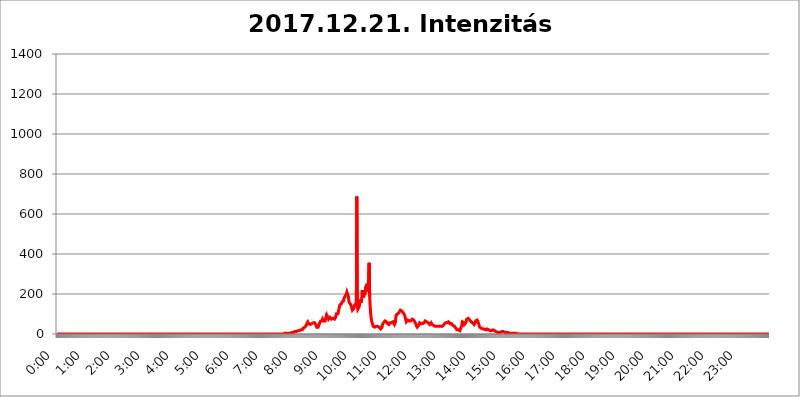
| Category | 2017.12.21. Intenzitás [W/m^2] |
|---|---|
| 0.0 | 0 |
| 0.0006944444444444445 | 0 |
| 0.001388888888888889 | 0 |
| 0.0020833333333333333 | 0 |
| 0.002777777777777778 | 0 |
| 0.003472222222222222 | 0 |
| 0.004166666666666667 | 0 |
| 0.004861111111111111 | 0 |
| 0.005555555555555556 | 0 |
| 0.0062499999999999995 | 0 |
| 0.006944444444444444 | 0 |
| 0.007638888888888889 | 0 |
| 0.008333333333333333 | 0 |
| 0.009027777777777779 | 0 |
| 0.009722222222222222 | 0 |
| 0.010416666666666666 | 0 |
| 0.011111111111111112 | 0 |
| 0.011805555555555555 | 0 |
| 0.012499999999999999 | 0 |
| 0.013194444444444444 | 0 |
| 0.013888888888888888 | 0 |
| 0.014583333333333332 | 0 |
| 0.015277777777777777 | 0 |
| 0.015972222222222224 | 0 |
| 0.016666666666666666 | 0 |
| 0.017361111111111112 | 0 |
| 0.018055555555555557 | 0 |
| 0.01875 | 0 |
| 0.019444444444444445 | 0 |
| 0.02013888888888889 | 0 |
| 0.020833333333333332 | 0 |
| 0.02152777777777778 | 0 |
| 0.022222222222222223 | 0 |
| 0.02291666666666667 | 0 |
| 0.02361111111111111 | 0 |
| 0.024305555555555556 | 0 |
| 0.024999999999999998 | 0 |
| 0.025694444444444447 | 0 |
| 0.02638888888888889 | 0 |
| 0.027083333333333334 | 0 |
| 0.027777777777777776 | 0 |
| 0.02847222222222222 | 0 |
| 0.029166666666666664 | 0 |
| 0.029861111111111113 | 0 |
| 0.030555555555555555 | 0 |
| 0.03125 | 0 |
| 0.03194444444444445 | 0 |
| 0.03263888888888889 | 0 |
| 0.03333333333333333 | 0 |
| 0.034027777777777775 | 0 |
| 0.034722222222222224 | 0 |
| 0.035416666666666666 | 0 |
| 0.036111111111111115 | 0 |
| 0.03680555555555556 | 0 |
| 0.0375 | 0 |
| 0.03819444444444444 | 0 |
| 0.03888888888888889 | 0 |
| 0.03958333333333333 | 0 |
| 0.04027777777777778 | 0 |
| 0.04097222222222222 | 0 |
| 0.041666666666666664 | 0 |
| 0.042361111111111106 | 0 |
| 0.04305555555555556 | 0 |
| 0.043750000000000004 | 0 |
| 0.044444444444444446 | 0 |
| 0.04513888888888889 | 0 |
| 0.04583333333333334 | 0 |
| 0.04652777777777778 | 0 |
| 0.04722222222222222 | 0 |
| 0.04791666666666666 | 0 |
| 0.04861111111111111 | 0 |
| 0.049305555555555554 | 0 |
| 0.049999999999999996 | 0 |
| 0.05069444444444445 | 0 |
| 0.051388888888888894 | 0 |
| 0.052083333333333336 | 0 |
| 0.05277777777777778 | 0 |
| 0.05347222222222222 | 0 |
| 0.05416666666666667 | 0 |
| 0.05486111111111111 | 0 |
| 0.05555555555555555 | 0 |
| 0.05625 | 0 |
| 0.05694444444444444 | 0 |
| 0.057638888888888885 | 0 |
| 0.05833333333333333 | 0 |
| 0.05902777777777778 | 0 |
| 0.059722222222222225 | 0 |
| 0.06041666666666667 | 0 |
| 0.061111111111111116 | 0 |
| 0.06180555555555556 | 0 |
| 0.0625 | 0 |
| 0.06319444444444444 | 0 |
| 0.06388888888888888 | 0 |
| 0.06458333333333334 | 0 |
| 0.06527777777777778 | 0 |
| 0.06597222222222222 | 0 |
| 0.06666666666666667 | 0 |
| 0.06736111111111111 | 0 |
| 0.06805555555555555 | 0 |
| 0.06874999999999999 | 0 |
| 0.06944444444444443 | 0 |
| 0.07013888888888889 | 0 |
| 0.07083333333333333 | 0 |
| 0.07152777777777779 | 0 |
| 0.07222222222222223 | 0 |
| 0.07291666666666667 | 0 |
| 0.07361111111111111 | 0 |
| 0.07430555555555556 | 0 |
| 0.075 | 0 |
| 0.07569444444444444 | 0 |
| 0.0763888888888889 | 0 |
| 0.07708333333333334 | 0 |
| 0.07777777777777778 | 0 |
| 0.07847222222222222 | 0 |
| 0.07916666666666666 | 0 |
| 0.0798611111111111 | 0 |
| 0.08055555555555556 | 0 |
| 0.08125 | 0 |
| 0.08194444444444444 | 0 |
| 0.08263888888888889 | 0 |
| 0.08333333333333333 | 0 |
| 0.08402777777777777 | 0 |
| 0.08472222222222221 | 0 |
| 0.08541666666666665 | 0 |
| 0.08611111111111112 | 0 |
| 0.08680555555555557 | 0 |
| 0.08750000000000001 | 0 |
| 0.08819444444444445 | 0 |
| 0.08888888888888889 | 0 |
| 0.08958333333333333 | 0 |
| 0.09027777777777778 | 0 |
| 0.09097222222222222 | 0 |
| 0.09166666666666667 | 0 |
| 0.09236111111111112 | 0 |
| 0.09305555555555556 | 0 |
| 0.09375 | 0 |
| 0.09444444444444444 | 0 |
| 0.09513888888888888 | 0 |
| 0.09583333333333333 | 0 |
| 0.09652777777777777 | 0 |
| 0.09722222222222222 | 0 |
| 0.09791666666666667 | 0 |
| 0.09861111111111111 | 0 |
| 0.09930555555555555 | 0 |
| 0.09999999999999999 | 0 |
| 0.10069444444444443 | 0 |
| 0.1013888888888889 | 0 |
| 0.10208333333333335 | 0 |
| 0.10277777777777779 | 0 |
| 0.10347222222222223 | 0 |
| 0.10416666666666667 | 0 |
| 0.10486111111111111 | 0 |
| 0.10555555555555556 | 0 |
| 0.10625 | 0 |
| 0.10694444444444444 | 0 |
| 0.1076388888888889 | 0 |
| 0.10833333333333334 | 0 |
| 0.10902777777777778 | 0 |
| 0.10972222222222222 | 0 |
| 0.1111111111111111 | 0 |
| 0.11180555555555556 | 0 |
| 0.11180555555555556 | 0 |
| 0.1125 | 0 |
| 0.11319444444444444 | 0 |
| 0.11388888888888889 | 0 |
| 0.11458333333333333 | 0 |
| 0.11527777777777777 | 0 |
| 0.11597222222222221 | 0 |
| 0.11666666666666665 | 0 |
| 0.1173611111111111 | 0 |
| 0.11805555555555557 | 0 |
| 0.11944444444444445 | 0 |
| 0.12013888888888889 | 0 |
| 0.12083333333333333 | 0 |
| 0.12152777777777778 | 0 |
| 0.12222222222222223 | 0 |
| 0.12291666666666667 | 0 |
| 0.12291666666666667 | 0 |
| 0.12361111111111112 | 0 |
| 0.12430555555555556 | 0 |
| 0.125 | 0 |
| 0.12569444444444444 | 0 |
| 0.12638888888888888 | 0 |
| 0.12708333333333333 | 0 |
| 0.16875 | 0 |
| 0.12847222222222224 | 0 |
| 0.12916666666666668 | 0 |
| 0.12986111111111112 | 0 |
| 0.13055555555555556 | 0 |
| 0.13125 | 0 |
| 0.13194444444444445 | 0 |
| 0.1326388888888889 | 0 |
| 0.13333333333333333 | 0 |
| 0.13402777777777777 | 0 |
| 0.13402777777777777 | 0 |
| 0.13472222222222222 | 0 |
| 0.13541666666666666 | 0 |
| 0.1361111111111111 | 0 |
| 0.13749999999999998 | 0 |
| 0.13819444444444443 | 0 |
| 0.1388888888888889 | 0 |
| 0.13958333333333334 | 0 |
| 0.14027777777777778 | 0 |
| 0.14097222222222222 | 0 |
| 0.14166666666666666 | 0 |
| 0.1423611111111111 | 0 |
| 0.14305555555555557 | 0 |
| 0.14375000000000002 | 0 |
| 0.14444444444444446 | 0 |
| 0.1451388888888889 | 0 |
| 0.1451388888888889 | 0 |
| 0.14652777777777778 | 0 |
| 0.14722222222222223 | 0 |
| 0.14791666666666667 | 0 |
| 0.1486111111111111 | 0 |
| 0.14930555555555555 | 0 |
| 0.15 | 0 |
| 0.15069444444444444 | 0 |
| 0.15138888888888888 | 0 |
| 0.15208333333333332 | 0 |
| 0.15277777777777776 | 0 |
| 0.15347222222222223 | 0 |
| 0.15416666666666667 | 0 |
| 0.15486111111111112 | 0 |
| 0.15555555555555556 | 0 |
| 0.15625 | 0 |
| 0.15694444444444444 | 0 |
| 0.15763888888888888 | 0 |
| 0.15833333333333333 | 0 |
| 0.15902777777777777 | 0 |
| 0.15972222222222224 | 0 |
| 0.16041666666666668 | 0 |
| 0.16111111111111112 | 0 |
| 0.16180555555555556 | 0 |
| 0.1625 | 0 |
| 0.16319444444444445 | 0 |
| 0.1638888888888889 | 0 |
| 0.16458333333333333 | 0 |
| 0.16527777777777777 | 0 |
| 0.16597222222222222 | 0 |
| 0.16666666666666666 | 0 |
| 0.1673611111111111 | 0 |
| 0.16805555555555554 | 0 |
| 0.16874999999999998 | 0 |
| 0.16944444444444443 | 0 |
| 0.17013888888888887 | 0 |
| 0.1708333333333333 | 0 |
| 0.17152777777777775 | 0 |
| 0.17222222222222225 | 0 |
| 0.1729166666666667 | 0 |
| 0.17361111111111113 | 0 |
| 0.17430555555555557 | 0 |
| 0.17500000000000002 | 0 |
| 0.17569444444444446 | 0 |
| 0.1763888888888889 | 0 |
| 0.17708333333333334 | 0 |
| 0.17777777777777778 | 0 |
| 0.17847222222222223 | 0 |
| 0.17916666666666667 | 0 |
| 0.1798611111111111 | 0 |
| 0.18055555555555555 | 0 |
| 0.18125 | 0 |
| 0.18194444444444444 | 0 |
| 0.1826388888888889 | 0 |
| 0.18333333333333335 | 0 |
| 0.1840277777777778 | 0 |
| 0.18472222222222223 | 0 |
| 0.18541666666666667 | 0 |
| 0.18611111111111112 | 0 |
| 0.18680555555555556 | 0 |
| 0.1875 | 0 |
| 0.18819444444444444 | 0 |
| 0.18888888888888888 | 0 |
| 0.18958333333333333 | 0 |
| 0.19027777777777777 | 0 |
| 0.1909722222222222 | 0 |
| 0.19166666666666665 | 0 |
| 0.19236111111111112 | 0 |
| 0.19305555555555554 | 0 |
| 0.19375 | 0 |
| 0.19444444444444445 | 0 |
| 0.1951388888888889 | 0 |
| 0.19583333333333333 | 0 |
| 0.19652777777777777 | 0 |
| 0.19722222222222222 | 0 |
| 0.19791666666666666 | 0 |
| 0.1986111111111111 | 0 |
| 0.19930555555555554 | 0 |
| 0.19999999999999998 | 0 |
| 0.20069444444444443 | 0 |
| 0.20138888888888887 | 0 |
| 0.2020833333333333 | 0 |
| 0.2027777777777778 | 0 |
| 0.2034722222222222 | 0 |
| 0.2041666666666667 | 0 |
| 0.20486111111111113 | 0 |
| 0.20555555555555557 | 0 |
| 0.20625000000000002 | 0 |
| 0.20694444444444446 | 0 |
| 0.2076388888888889 | 0 |
| 0.20833333333333334 | 0 |
| 0.20902777777777778 | 0 |
| 0.20972222222222223 | 0 |
| 0.21041666666666667 | 0 |
| 0.2111111111111111 | 0 |
| 0.21180555555555555 | 0 |
| 0.2125 | 0 |
| 0.21319444444444444 | 0 |
| 0.2138888888888889 | 0 |
| 0.21458333333333335 | 0 |
| 0.2152777777777778 | 0 |
| 0.21597222222222223 | 0 |
| 0.21666666666666667 | 0 |
| 0.21736111111111112 | 0 |
| 0.21805555555555556 | 0 |
| 0.21875 | 0 |
| 0.21944444444444444 | 0 |
| 0.22013888888888888 | 0 |
| 0.22083333333333333 | 0 |
| 0.22152777777777777 | 0 |
| 0.2222222222222222 | 0 |
| 0.22291666666666665 | 0 |
| 0.2236111111111111 | 0 |
| 0.22430555555555556 | 0 |
| 0.225 | 0 |
| 0.22569444444444445 | 0 |
| 0.2263888888888889 | 0 |
| 0.22708333333333333 | 0 |
| 0.22777777777777777 | 0 |
| 0.22847222222222222 | 0 |
| 0.22916666666666666 | 0 |
| 0.2298611111111111 | 0 |
| 0.23055555555555554 | 0 |
| 0.23124999999999998 | 0 |
| 0.23194444444444443 | 0 |
| 0.23263888888888887 | 0 |
| 0.2333333333333333 | 0 |
| 0.2340277777777778 | 0 |
| 0.2347222222222222 | 0 |
| 0.2354166666666667 | 0 |
| 0.23611111111111113 | 0 |
| 0.23680555555555557 | 0 |
| 0.23750000000000002 | 0 |
| 0.23819444444444446 | 0 |
| 0.2388888888888889 | 0 |
| 0.23958333333333334 | 0 |
| 0.24027777777777778 | 0 |
| 0.24097222222222223 | 0 |
| 0.24166666666666667 | 0 |
| 0.2423611111111111 | 0 |
| 0.24305555555555555 | 0 |
| 0.24375 | 0 |
| 0.24444444444444446 | 0 |
| 0.24513888888888888 | 0 |
| 0.24583333333333335 | 0 |
| 0.2465277777777778 | 0 |
| 0.24722222222222223 | 0 |
| 0.24791666666666667 | 0 |
| 0.24861111111111112 | 0 |
| 0.24930555555555556 | 0 |
| 0.25 | 0 |
| 0.25069444444444444 | 0 |
| 0.2513888888888889 | 0 |
| 0.2520833333333333 | 0 |
| 0.25277777777777777 | 0 |
| 0.2534722222222222 | 0 |
| 0.25416666666666665 | 0 |
| 0.2548611111111111 | 0 |
| 0.2555555555555556 | 0 |
| 0.25625000000000003 | 0 |
| 0.2569444444444445 | 0 |
| 0.2576388888888889 | 0 |
| 0.25833333333333336 | 0 |
| 0.2590277777777778 | 0 |
| 0.25972222222222224 | 0 |
| 0.2604166666666667 | 0 |
| 0.2611111111111111 | 0 |
| 0.26180555555555557 | 0 |
| 0.2625 | 0 |
| 0.26319444444444445 | 0 |
| 0.2638888888888889 | 0 |
| 0.26458333333333334 | 0 |
| 0.2652777777777778 | 0 |
| 0.2659722222222222 | 0 |
| 0.26666666666666666 | 0 |
| 0.2673611111111111 | 0 |
| 0.26805555555555555 | 0 |
| 0.26875 | 0 |
| 0.26944444444444443 | 0 |
| 0.2701388888888889 | 0 |
| 0.2708333333333333 | 0 |
| 0.27152777777777776 | 0 |
| 0.2722222222222222 | 0 |
| 0.27291666666666664 | 0 |
| 0.2736111111111111 | 0 |
| 0.2743055555555555 | 0 |
| 0.27499999999999997 | 0 |
| 0.27569444444444446 | 0 |
| 0.27638888888888885 | 0 |
| 0.27708333333333335 | 0 |
| 0.2777777777777778 | 0 |
| 0.27847222222222223 | 0 |
| 0.2791666666666667 | 0 |
| 0.2798611111111111 | 0 |
| 0.28055555555555556 | 0 |
| 0.28125 | 0 |
| 0.28194444444444444 | 0 |
| 0.2826388888888889 | 0 |
| 0.2833333333333333 | 0 |
| 0.28402777777777777 | 0 |
| 0.2847222222222222 | 0 |
| 0.28541666666666665 | 0 |
| 0.28611111111111115 | 0 |
| 0.28680555555555554 | 0 |
| 0.28750000000000003 | 0 |
| 0.2881944444444445 | 0 |
| 0.2888888888888889 | 0 |
| 0.28958333333333336 | 0 |
| 0.2902777777777778 | 0 |
| 0.29097222222222224 | 0 |
| 0.2916666666666667 | 0 |
| 0.2923611111111111 | 0 |
| 0.29305555555555557 | 0 |
| 0.29375 | 0 |
| 0.29444444444444445 | 0 |
| 0.2951388888888889 | 0 |
| 0.29583333333333334 | 0 |
| 0.2965277777777778 | 0 |
| 0.2972222222222222 | 0 |
| 0.29791666666666666 | 0 |
| 0.2986111111111111 | 0 |
| 0.29930555555555555 | 0 |
| 0.3 | 0 |
| 0.30069444444444443 | 0 |
| 0.3013888888888889 | 0 |
| 0.3020833333333333 | 0 |
| 0.30277777777777776 | 0 |
| 0.3034722222222222 | 0 |
| 0.30416666666666664 | 0 |
| 0.3048611111111111 | 0 |
| 0.3055555555555555 | 0 |
| 0.30624999999999997 | 0 |
| 0.3069444444444444 | 0 |
| 0.3076388888888889 | 0 |
| 0.30833333333333335 | 0 |
| 0.3090277777777778 | 0 |
| 0.30972222222222223 | 0 |
| 0.3104166666666667 | 0 |
| 0.3111111111111111 | 0 |
| 0.31180555555555556 | 0 |
| 0.3125 | 0 |
| 0.31319444444444444 | 0 |
| 0.3138888888888889 | 0 |
| 0.3145833333333333 | 0 |
| 0.31527777777777777 | 0 |
| 0.3159722222222222 | 0 |
| 0.31666666666666665 | 0 |
| 0.31736111111111115 | 0 |
| 0.31805555555555554 | 0 |
| 0.31875000000000003 | 3.525 |
| 0.3194444444444445 | 3.525 |
| 0.3201388888888889 | 3.525 |
| 0.32083333333333336 | 3.525 |
| 0.3215277777777778 | 3.525 |
| 0.32222222222222224 | 3.525 |
| 0.3229166666666667 | 3.525 |
| 0.3236111111111111 | 3.525 |
| 0.32430555555555557 | 3.525 |
| 0.325 | 3.525 |
| 0.32569444444444445 | 3.525 |
| 0.3263888888888889 | 3.525 |
| 0.32708333333333334 | 3.525 |
| 0.3277777777777778 | 3.525 |
| 0.3284722222222222 | 3.525 |
| 0.32916666666666666 | 7.887 |
| 0.3298611111111111 | 7.887 |
| 0.33055555555555555 | 7.887 |
| 0.33125 | 7.887 |
| 0.33194444444444443 | 7.887 |
| 0.3326388888888889 | 12.257 |
| 0.3333333333333333 | 12.257 |
| 0.3340277777777778 | 12.257 |
| 0.3347222222222222 | 12.257 |
| 0.3354166666666667 | 12.257 |
| 0.3361111111111111 | 12.257 |
| 0.3368055555555556 | 12.257 |
| 0.33749999999999997 | 16.636 |
| 0.33819444444444446 | 16.636 |
| 0.33888888888888885 | 16.636 |
| 0.33958333333333335 | 16.636 |
| 0.34027777777777773 | 16.636 |
| 0.34097222222222223 | 21.024 |
| 0.3416666666666666 | 21.024 |
| 0.3423611111111111 | 21.024 |
| 0.3430555555555555 | 21.024 |
| 0.34375 | 21.024 |
| 0.3444444444444445 | 25.419 |
| 0.3451388888888889 | 29.823 |
| 0.3458333333333334 | 29.823 |
| 0.34652777777777777 | 29.823 |
| 0.34722222222222227 | 34.234 |
| 0.34791666666666665 | 34.234 |
| 0.34861111111111115 | 38.653 |
| 0.34930555555555554 | 43.079 |
| 0.35000000000000003 | 51.951 |
| 0.3506944444444444 | 56.398 |
| 0.3513888888888889 | 60.85 |
| 0.3520833333333333 | 56.398 |
| 0.3527777777777778 | 51.951 |
| 0.3534722222222222 | 47.511 |
| 0.3541666666666667 | 47.511 |
| 0.3548611111111111 | 47.511 |
| 0.35555555555555557 | 47.511 |
| 0.35625 | 51.951 |
| 0.35694444444444445 | 51.951 |
| 0.3576388888888889 | 56.398 |
| 0.35833333333333334 | 56.398 |
| 0.3590277777777778 | 56.398 |
| 0.3597222222222222 | 51.951 |
| 0.36041666666666666 | 51.951 |
| 0.3611111111111111 | 56.398 |
| 0.36180555555555555 | 56.398 |
| 0.3625 | 47.511 |
| 0.36319444444444443 | 43.079 |
| 0.3638888888888889 | 34.234 |
| 0.3645833333333333 | 34.234 |
| 0.3652777777777778 | 34.234 |
| 0.3659722222222222 | 34.234 |
| 0.3666666666666667 | 38.653 |
| 0.3673611111111111 | 47.511 |
| 0.3680555555555556 | 56.398 |
| 0.36874999999999997 | 56.398 |
| 0.36944444444444446 | 65.31 |
| 0.37013888888888885 | 65.31 |
| 0.37083333333333335 | 60.85 |
| 0.37152777777777773 | 65.31 |
| 0.37222222222222223 | 74.246 |
| 0.3729166666666666 | 74.246 |
| 0.3736111111111111 | 65.31 |
| 0.3743055555555555 | 60.85 |
| 0.375 | 65.31 |
| 0.3756944444444445 | 65.31 |
| 0.3763888888888889 | 69.775 |
| 0.3770833333333334 | 87.692 |
| 0.37777777777777777 | 96.682 |
| 0.37847222222222227 | 101.184 |
| 0.37916666666666665 | 92.184 |
| 0.37986111111111115 | 83.205 |
| 0.38055555555555554 | 74.246 |
| 0.38125000000000003 | 74.246 |
| 0.3819444444444444 | 74.246 |
| 0.3826388888888889 | 83.205 |
| 0.3833333333333333 | 83.205 |
| 0.3840277777777778 | 78.722 |
| 0.3847222222222222 | 74.246 |
| 0.3854166666666667 | 74.246 |
| 0.3861111111111111 | 74.246 |
| 0.38680555555555557 | 78.722 |
| 0.3875 | 74.246 |
| 0.38819444444444445 | 74.246 |
| 0.3888888888888889 | 74.246 |
| 0.38958333333333334 | 78.722 |
| 0.3902777777777778 | 83.205 |
| 0.3909722222222222 | 92.184 |
| 0.39166666666666666 | 101.184 |
| 0.3923611111111111 | 96.682 |
| 0.39305555555555555 | 101.184 |
| 0.39375 | 101.184 |
| 0.39444444444444443 | 114.716 |
| 0.3951388888888889 | 123.758 |
| 0.3958333333333333 | 137.347 |
| 0.3965277777777778 | 146.423 |
| 0.3972222222222222 | 146.423 |
| 0.3979166666666667 | 146.423 |
| 0.3986111111111111 | 150.964 |
| 0.3993055555555556 | 160.056 |
| 0.39999999999999997 | 155.509 |
| 0.40069444444444446 | 155.509 |
| 0.40138888888888885 | 164.605 |
| 0.40208333333333335 | 178.264 |
| 0.40277777777777773 | 182.82 |
| 0.40347222222222223 | 187.378 |
| 0.4041666666666666 | 187.378 |
| 0.4048611111111111 | 191.937 |
| 0.4055555555555555 | 201.058 |
| 0.40625 | 210.182 |
| 0.4069444444444445 | 214.746 |
| 0.4076388888888889 | 214.746 |
| 0.4083333333333334 | 187.378 |
| 0.40902777777777777 | 164.605 |
| 0.40972222222222227 | 155.509 |
| 0.41041666666666665 | 150.964 |
| 0.41111111111111115 | 150.964 |
| 0.41180555555555554 | 146.423 |
| 0.41250000000000003 | 137.347 |
| 0.4131944444444444 | 128.284 |
| 0.4138888888888889 | 119.235 |
| 0.4145833333333333 | 119.235 |
| 0.4152777777777778 | 123.758 |
| 0.4159722222222222 | 128.284 |
| 0.4166666666666667 | 137.347 |
| 0.4173611111111111 | 146.423 |
| 0.41805555555555557 | 146.423 |
| 0.41875 | 146.423 |
| 0.41944444444444445 | 150.964 |
| 0.4201388888888889 | 687.544 |
| 0.42083333333333334 | 141.884 |
| 0.4215277777777778 | 123.758 |
| 0.4222222222222222 | 119.235 |
| 0.42291666666666666 | 128.284 |
| 0.4236111111111111 | 137.347 |
| 0.42430555555555555 | 155.509 |
| 0.425 | 173.709 |
| 0.42569444444444443 | 155.509 |
| 0.4263888888888889 | 150.964 |
| 0.4270833333333333 | 173.709 |
| 0.4277777777777778 | 219.309 |
| 0.4284722222222222 | 201.058 |
| 0.4291666666666667 | 191.937 |
| 0.4298611111111111 | 182.82 |
| 0.4305555555555556 | 214.746 |
| 0.43124999999999997 | 196.497 |
| 0.43194444444444446 | 214.746 |
| 0.43263888888888885 | 237.564 |
| 0.43333333333333335 | 223.873 |
| 0.43402777777777773 | 251.251 |
| 0.43472222222222223 | 255.813 |
| 0.4354166666666666 | 228.436 |
| 0.4361111111111111 | 210.182 |
| 0.4368055555555555 | 205.62 |
| 0.4375 | 355.712 |
| 0.4381944444444445 | 187.378 |
| 0.4388888888888889 | 137.347 |
| 0.4395833333333334 | 101.184 |
| 0.44027777777777777 | 78.722 |
| 0.44097222222222227 | 65.31 |
| 0.44166666666666665 | 56.398 |
| 0.44236111111111115 | 47.511 |
| 0.44305555555555554 | 38.653 |
| 0.44375000000000003 | 38.653 |
| 0.4444444444444444 | 38.653 |
| 0.4451388888888889 | 34.234 |
| 0.4458333333333333 | 34.234 |
| 0.4465277777777778 | 34.234 |
| 0.4472222222222222 | 38.653 |
| 0.4479166666666667 | 38.653 |
| 0.4486111111111111 | 38.653 |
| 0.44930555555555557 | 38.653 |
| 0.45 | 38.653 |
| 0.45069444444444445 | 38.653 |
| 0.4513888888888889 | 34.234 |
| 0.45208333333333334 | 34.234 |
| 0.4527777777777778 | 29.823 |
| 0.4534722222222222 | 25.419 |
| 0.45416666666666666 | 25.419 |
| 0.4548611111111111 | 25.419 |
| 0.45555555555555555 | 34.234 |
| 0.45625 | 47.511 |
| 0.45694444444444443 | 51.951 |
| 0.4576388888888889 | 56.398 |
| 0.4583333333333333 | 56.398 |
| 0.4590277777777778 | 60.85 |
| 0.4597222222222222 | 65.31 |
| 0.4604166666666667 | 65.31 |
| 0.4611111111111111 | 65.31 |
| 0.4618055555555556 | 60.85 |
| 0.46249999999999997 | 56.398 |
| 0.46319444444444446 | 51.951 |
| 0.46388888888888885 | 47.511 |
| 0.46458333333333335 | 47.511 |
| 0.46527777777777773 | 47.511 |
| 0.46597222222222223 | 51.951 |
| 0.4666666666666666 | 56.398 |
| 0.4673611111111111 | 56.398 |
| 0.4680555555555555 | 56.398 |
| 0.46875 | 56.398 |
| 0.4694444444444445 | 60.85 |
| 0.4701388888888889 | 56.398 |
| 0.4708333333333334 | 60.85 |
| 0.47152777777777777 | 56.398 |
| 0.47222222222222227 | 56.398 |
| 0.47291666666666665 | 47.511 |
| 0.47361111111111115 | 43.079 |
| 0.47430555555555554 | 60.85 |
| 0.47500000000000003 | 87.692 |
| 0.4756944444444444 | 96.682 |
| 0.4763888888888889 | 96.682 |
| 0.4770833333333333 | 96.682 |
| 0.4777777777777778 | 101.184 |
| 0.4784722222222222 | 105.69 |
| 0.4791666666666667 | 105.69 |
| 0.4798611111111111 | 110.201 |
| 0.48055555555555557 | 110.201 |
| 0.48125 | 119.235 |
| 0.48194444444444445 | 119.235 |
| 0.4826388888888889 | 119.235 |
| 0.48333333333333334 | 114.716 |
| 0.4840277777777778 | 110.201 |
| 0.4847222222222222 | 110.201 |
| 0.48541666666666666 | 105.69 |
| 0.4861111111111111 | 101.184 |
| 0.48680555555555555 | 101.184 |
| 0.4875 | 92.184 |
| 0.48819444444444443 | 78.722 |
| 0.4888888888888889 | 69.775 |
| 0.4895833333333333 | 60.85 |
| 0.4902777777777778 | 65.31 |
| 0.4909722222222222 | 65.31 |
| 0.4916666666666667 | 69.775 |
| 0.4923611111111111 | 69.775 |
| 0.4930555555555556 | 65.31 |
| 0.49374999999999997 | 65.31 |
| 0.49444444444444446 | 65.31 |
| 0.49513888888888885 | 65.31 |
| 0.49583333333333335 | 65.31 |
| 0.49652777777777773 | 65.31 |
| 0.49722222222222223 | 69.775 |
| 0.4979166666666666 | 74.246 |
| 0.4986111111111111 | 78.722 |
| 0.4993055555555555 | 78.722 |
| 0.5 | 69.775 |
| 0.5006944444444444 | 65.31 |
| 0.5013888888888889 | 60.85 |
| 0.5020833333333333 | 56.398 |
| 0.5027777777777778 | 51.951 |
| 0.5034722222222222 | 43.079 |
| 0.5041666666666667 | 38.653 |
| 0.5048611111111111 | 34.234 |
| 0.5055555555555555 | 38.653 |
| 0.50625 | 38.653 |
| 0.5069444444444444 | 43.079 |
| 0.5076388888888889 | 47.511 |
| 0.5083333333333333 | 56.398 |
| 0.5090277777777777 | 56.398 |
| 0.5097222222222222 | 51.951 |
| 0.5104166666666666 | 51.951 |
| 0.5111111111111112 | 51.951 |
| 0.5118055555555555 | 56.398 |
| 0.5125000000000001 | 51.951 |
| 0.5131944444444444 | 51.951 |
| 0.513888888888889 | 56.398 |
| 0.5145833333333333 | 56.398 |
| 0.5152777777777778 | 60.85 |
| 0.5159722222222222 | 65.31 |
| 0.5166666666666667 | 65.31 |
| 0.517361111111111 | 65.31 |
| 0.5180555555555556 | 60.85 |
| 0.5187499999999999 | 60.85 |
| 0.5194444444444445 | 56.398 |
| 0.5201388888888888 | 56.398 |
| 0.5208333333333334 | 56.398 |
| 0.5215277777777778 | 51.951 |
| 0.5222222222222223 | 47.511 |
| 0.5229166666666667 | 51.951 |
| 0.5236111111111111 | 51.951 |
| 0.5243055555555556 | 56.398 |
| 0.525 | 51.951 |
| 0.5256944444444445 | 47.511 |
| 0.5263888888888889 | 43.079 |
| 0.5270833333333333 | 43.079 |
| 0.5277777777777778 | 43.079 |
| 0.5284722222222222 | 38.653 |
| 0.5291666666666667 | 38.653 |
| 0.5298611111111111 | 38.653 |
| 0.5305555555555556 | 38.653 |
| 0.53125 | 38.653 |
| 0.5319444444444444 | 38.653 |
| 0.5326388888888889 | 38.653 |
| 0.5333333333333333 | 38.653 |
| 0.5340277777777778 | 38.653 |
| 0.5347222222222222 | 38.653 |
| 0.5354166666666667 | 38.653 |
| 0.5361111111111111 | 38.653 |
| 0.5368055555555555 | 38.653 |
| 0.5375 | 38.653 |
| 0.5381944444444444 | 38.653 |
| 0.5388888888888889 | 38.653 |
| 0.5395833333333333 | 38.653 |
| 0.5402777777777777 | 38.653 |
| 0.5409722222222222 | 43.079 |
| 0.5416666666666666 | 43.079 |
| 0.5423611111111112 | 47.511 |
| 0.5430555555555555 | 51.951 |
| 0.5437500000000001 | 51.951 |
| 0.5444444444444444 | 56.398 |
| 0.545138888888889 | 56.398 |
| 0.5458333333333333 | 56.398 |
| 0.5465277777777778 | 56.398 |
| 0.5472222222222222 | 60.85 |
| 0.5479166666666667 | 60.85 |
| 0.548611111111111 | 60.85 |
| 0.5493055555555556 | 56.398 |
| 0.5499999999999999 | 56.398 |
| 0.5506944444444445 | 51.951 |
| 0.5513888888888888 | 51.951 |
| 0.5520833333333334 | 51.951 |
| 0.5527777777777778 | 51.951 |
| 0.5534722222222223 | 47.511 |
| 0.5541666666666667 | 47.511 |
| 0.5548611111111111 | 43.079 |
| 0.5555555555555556 | 43.079 |
| 0.55625 | 38.653 |
| 0.5569444444444445 | 38.653 |
| 0.5576388888888889 | 38.653 |
| 0.5583333333333333 | 34.234 |
| 0.5590277777777778 | 29.823 |
| 0.5597222222222222 | 25.419 |
| 0.5604166666666667 | 21.024 |
| 0.5611111111111111 | 21.024 |
| 0.5618055555555556 | 21.024 |
| 0.5625 | 21.024 |
| 0.5631944444444444 | 16.636 |
| 0.5638888888888889 | 16.636 |
| 0.5645833333333333 | 16.636 |
| 0.5652777777777778 | 21.024 |
| 0.5659722222222222 | 29.823 |
| 0.5666666666666667 | 34.234 |
| 0.5673611111111111 | 43.079 |
| 0.5680555555555555 | 60.85 |
| 0.56875 | 65.31 |
| 0.5694444444444444 | 60.85 |
| 0.5701388888888889 | 56.398 |
| 0.5708333333333333 | 47.511 |
| 0.5715277777777777 | 47.511 |
| 0.5722222222222222 | 47.511 |
| 0.5729166666666666 | 56.398 |
| 0.5736111111111112 | 65.31 |
| 0.5743055555555555 | 74.246 |
| 0.5750000000000001 | 74.246 |
| 0.5756944444444444 | 74.246 |
| 0.576388888888889 | 78.722 |
| 0.5770833333333333 | 78.722 |
| 0.5777777777777778 | 74.246 |
| 0.5784722222222222 | 69.775 |
| 0.5791666666666667 | 65.31 |
| 0.579861111111111 | 65.31 |
| 0.5805555555555556 | 60.85 |
| 0.5812499999999999 | 56.398 |
| 0.5819444444444445 | 56.398 |
| 0.5826388888888888 | 56.398 |
| 0.5833333333333334 | 56.398 |
| 0.5840277777777778 | 51.951 |
| 0.5847222222222223 | 47.511 |
| 0.5854166666666667 | 51.951 |
| 0.5861111111111111 | 56.398 |
| 0.5868055555555556 | 65.31 |
| 0.5875 | 69.775 |
| 0.5881944444444445 | 69.775 |
| 0.5888888888888889 | 69.775 |
| 0.5895833333333333 | 69.775 |
| 0.5902777777777778 | 60.85 |
| 0.5909722222222222 | 51.951 |
| 0.5916666666666667 | 47.511 |
| 0.5923611111111111 | 34.234 |
| 0.5930555555555556 | 29.823 |
| 0.59375 | 29.823 |
| 0.5944444444444444 | 29.823 |
| 0.5951388888888889 | 29.823 |
| 0.5958333333333333 | 29.823 |
| 0.5965277777777778 | 25.419 |
| 0.5972222222222222 | 25.419 |
| 0.5979166666666667 | 25.419 |
| 0.5986111111111111 | 25.419 |
| 0.5993055555555555 | 25.419 |
| 0.6 | 25.419 |
| 0.6006944444444444 | 21.024 |
| 0.6013888888888889 | 21.024 |
| 0.6020833333333333 | 21.024 |
| 0.6027777777777777 | 25.419 |
| 0.6034722222222222 | 21.024 |
| 0.6041666666666666 | 21.024 |
| 0.6048611111111112 | 21.024 |
| 0.6055555555555555 | 16.636 |
| 0.6062500000000001 | 16.636 |
| 0.6069444444444444 | 16.636 |
| 0.607638888888889 | 16.636 |
| 0.6083333333333333 | 12.257 |
| 0.6090277777777778 | 16.636 |
| 0.6097222222222222 | 16.636 |
| 0.6104166666666667 | 16.636 |
| 0.611111111111111 | 21.024 |
| 0.6118055555555556 | 21.024 |
| 0.6124999999999999 | 16.636 |
| 0.6131944444444445 | 16.636 |
| 0.6138888888888888 | 12.257 |
| 0.6145833333333334 | 12.257 |
| 0.6152777777777778 | 12.257 |
| 0.6159722222222223 | 12.257 |
| 0.6166666666666667 | 12.257 |
| 0.6173611111111111 | 7.887 |
| 0.6180555555555556 | 7.887 |
| 0.61875 | 3.525 |
| 0.6194444444444445 | 7.887 |
| 0.6201388888888889 | 7.887 |
| 0.6208333333333333 | 7.887 |
| 0.6215277777777778 | 7.887 |
| 0.6222222222222222 | 7.887 |
| 0.6229166666666667 | 12.257 |
| 0.6236111111111111 | 12.257 |
| 0.6243055555555556 | 12.257 |
| 0.625 | 12.257 |
| 0.6256944444444444 | 12.257 |
| 0.6263888888888889 | 7.887 |
| 0.6270833333333333 | 7.887 |
| 0.6277777777777778 | 7.887 |
| 0.6284722222222222 | 7.887 |
| 0.6291666666666667 | 7.887 |
| 0.6298611111111111 | 7.887 |
| 0.6305555555555555 | 7.887 |
| 0.63125 | 7.887 |
| 0.6319444444444444 | 7.887 |
| 0.6326388888888889 | 7.887 |
| 0.6333333333333333 | 3.525 |
| 0.6340277777777777 | 3.525 |
| 0.6347222222222222 | 3.525 |
| 0.6354166666666666 | 3.525 |
| 0.6361111111111112 | 3.525 |
| 0.6368055555555555 | 3.525 |
| 0.6375000000000001 | 3.525 |
| 0.6381944444444444 | 3.525 |
| 0.638888888888889 | 3.525 |
| 0.6395833333333333 | 3.525 |
| 0.6402777777777778 | 3.525 |
| 0.6409722222222222 | 3.525 |
| 0.6416666666666667 | 3.525 |
| 0.642361111111111 | 3.525 |
| 0.6430555555555556 | 3.525 |
| 0.6437499999999999 | 3.525 |
| 0.6444444444444445 | 3.525 |
| 0.6451388888888888 | 0 |
| 0.6458333333333334 | 0 |
| 0.6465277777777778 | 0 |
| 0.6472222222222223 | 0 |
| 0.6479166666666667 | 0 |
| 0.6486111111111111 | 0 |
| 0.6493055555555556 | 0 |
| 0.65 | 0 |
| 0.6506944444444445 | 0 |
| 0.6513888888888889 | 0 |
| 0.6520833333333333 | 0 |
| 0.6527777777777778 | 0 |
| 0.6534722222222222 | 0 |
| 0.6541666666666667 | 0 |
| 0.6548611111111111 | 0 |
| 0.6555555555555556 | 0 |
| 0.65625 | 0 |
| 0.6569444444444444 | 0 |
| 0.6576388888888889 | 0 |
| 0.6583333333333333 | 0 |
| 0.6590277777777778 | 0 |
| 0.6597222222222222 | 0 |
| 0.6604166666666667 | 0 |
| 0.6611111111111111 | 0 |
| 0.6618055555555555 | 0 |
| 0.6625 | 0 |
| 0.6631944444444444 | 0 |
| 0.6638888888888889 | 0 |
| 0.6645833333333333 | 0 |
| 0.6652777777777777 | 0 |
| 0.6659722222222222 | 0 |
| 0.6666666666666666 | 0 |
| 0.6673611111111111 | 0 |
| 0.6680555555555556 | 0 |
| 0.6687500000000001 | 0 |
| 0.6694444444444444 | 0 |
| 0.6701388888888888 | 0 |
| 0.6708333333333334 | 0 |
| 0.6715277777777778 | 0 |
| 0.6722222222222222 | 0 |
| 0.6729166666666666 | 0 |
| 0.6736111111111112 | 0 |
| 0.6743055555555556 | 0 |
| 0.6749999999999999 | 0 |
| 0.6756944444444444 | 0 |
| 0.6763888888888889 | 0 |
| 0.6770833333333334 | 0 |
| 0.6777777777777777 | 0 |
| 0.6784722222222223 | 0 |
| 0.6791666666666667 | 0 |
| 0.6798611111111111 | 0 |
| 0.6805555555555555 | 0 |
| 0.68125 | 0 |
| 0.6819444444444445 | 0 |
| 0.6826388888888889 | 0 |
| 0.6833333333333332 | 0 |
| 0.6840277777777778 | 0 |
| 0.6847222222222222 | 0 |
| 0.6854166666666667 | 0 |
| 0.686111111111111 | 0 |
| 0.6868055555555556 | 0 |
| 0.6875 | 0 |
| 0.6881944444444444 | 0 |
| 0.688888888888889 | 0 |
| 0.6895833333333333 | 0 |
| 0.6902777777777778 | 0 |
| 0.6909722222222222 | 0 |
| 0.6916666666666668 | 0 |
| 0.6923611111111111 | 0 |
| 0.6930555555555555 | 0 |
| 0.69375 | 0 |
| 0.6944444444444445 | 0 |
| 0.6951388888888889 | 0 |
| 0.6958333333333333 | 0 |
| 0.6965277777777777 | 0 |
| 0.6972222222222223 | 0 |
| 0.6979166666666666 | 0 |
| 0.6986111111111111 | 0 |
| 0.6993055555555556 | 0 |
| 0.7000000000000001 | 0 |
| 0.7006944444444444 | 0 |
| 0.7013888888888888 | 0 |
| 0.7020833333333334 | 0 |
| 0.7027777777777778 | 0 |
| 0.7034722222222222 | 0 |
| 0.7041666666666666 | 0 |
| 0.7048611111111112 | 0 |
| 0.7055555555555556 | 0 |
| 0.7062499999999999 | 0 |
| 0.7069444444444444 | 0 |
| 0.7076388888888889 | 0 |
| 0.7083333333333334 | 0 |
| 0.7090277777777777 | 0 |
| 0.7097222222222223 | 0 |
| 0.7104166666666667 | 0 |
| 0.7111111111111111 | 0 |
| 0.7118055555555555 | 0 |
| 0.7125 | 0 |
| 0.7131944444444445 | 0 |
| 0.7138888888888889 | 0 |
| 0.7145833333333332 | 0 |
| 0.7152777777777778 | 0 |
| 0.7159722222222222 | 0 |
| 0.7166666666666667 | 0 |
| 0.717361111111111 | 0 |
| 0.7180555555555556 | 0 |
| 0.71875 | 0 |
| 0.7194444444444444 | 0 |
| 0.720138888888889 | 0 |
| 0.7208333333333333 | 0 |
| 0.7215277777777778 | 0 |
| 0.7222222222222222 | 0 |
| 0.7229166666666668 | 0 |
| 0.7236111111111111 | 0 |
| 0.7243055555555555 | 0 |
| 0.725 | 0 |
| 0.7256944444444445 | 0 |
| 0.7263888888888889 | 0 |
| 0.7270833333333333 | 0 |
| 0.7277777777777777 | 0 |
| 0.7284722222222223 | 0 |
| 0.7291666666666666 | 0 |
| 0.7298611111111111 | 0 |
| 0.7305555555555556 | 0 |
| 0.7312500000000001 | 0 |
| 0.7319444444444444 | 0 |
| 0.7326388888888888 | 0 |
| 0.7333333333333334 | 0 |
| 0.7340277777777778 | 0 |
| 0.7347222222222222 | 0 |
| 0.7354166666666666 | 0 |
| 0.7361111111111112 | 0 |
| 0.7368055555555556 | 0 |
| 0.7374999999999999 | 0 |
| 0.7381944444444444 | 0 |
| 0.7388888888888889 | 0 |
| 0.7395833333333334 | 0 |
| 0.7402777777777777 | 0 |
| 0.7409722222222223 | 0 |
| 0.7416666666666667 | 0 |
| 0.7423611111111111 | 0 |
| 0.7430555555555555 | 0 |
| 0.74375 | 0 |
| 0.7444444444444445 | 0 |
| 0.7451388888888889 | 0 |
| 0.7458333333333332 | 0 |
| 0.7465277777777778 | 0 |
| 0.7472222222222222 | 0 |
| 0.7479166666666667 | 0 |
| 0.748611111111111 | 0 |
| 0.7493055555555556 | 0 |
| 0.75 | 0 |
| 0.7506944444444444 | 0 |
| 0.751388888888889 | 0 |
| 0.7520833333333333 | 0 |
| 0.7527777777777778 | 0 |
| 0.7534722222222222 | 0 |
| 0.7541666666666668 | 0 |
| 0.7548611111111111 | 0 |
| 0.7555555555555555 | 0 |
| 0.75625 | 0 |
| 0.7569444444444445 | 0 |
| 0.7576388888888889 | 0 |
| 0.7583333333333333 | 0 |
| 0.7590277777777777 | 0 |
| 0.7597222222222223 | 0 |
| 0.7604166666666666 | 0 |
| 0.7611111111111111 | 0 |
| 0.7618055555555556 | 0 |
| 0.7625000000000001 | 0 |
| 0.7631944444444444 | 0 |
| 0.7638888888888888 | 0 |
| 0.7645833333333334 | 0 |
| 0.7652777777777778 | 0 |
| 0.7659722222222222 | 0 |
| 0.7666666666666666 | 0 |
| 0.7673611111111112 | 0 |
| 0.7680555555555556 | 0 |
| 0.7687499999999999 | 0 |
| 0.7694444444444444 | 0 |
| 0.7701388888888889 | 0 |
| 0.7708333333333334 | 0 |
| 0.7715277777777777 | 0 |
| 0.7722222222222223 | 0 |
| 0.7729166666666667 | 0 |
| 0.7736111111111111 | 0 |
| 0.7743055555555555 | 0 |
| 0.775 | 0 |
| 0.7756944444444445 | 0 |
| 0.7763888888888889 | 0 |
| 0.7770833333333332 | 0 |
| 0.7777777777777778 | 0 |
| 0.7784722222222222 | 0 |
| 0.7791666666666667 | 0 |
| 0.779861111111111 | 0 |
| 0.7805555555555556 | 0 |
| 0.78125 | 0 |
| 0.7819444444444444 | 0 |
| 0.782638888888889 | 0 |
| 0.7833333333333333 | 0 |
| 0.7840277777777778 | 0 |
| 0.7847222222222222 | 0 |
| 0.7854166666666668 | 0 |
| 0.7861111111111111 | 0 |
| 0.7868055555555555 | 0 |
| 0.7875 | 0 |
| 0.7881944444444445 | 0 |
| 0.7888888888888889 | 0 |
| 0.7895833333333333 | 0 |
| 0.7902777777777777 | 0 |
| 0.7909722222222223 | 0 |
| 0.7916666666666666 | 0 |
| 0.7923611111111111 | 0 |
| 0.7930555555555556 | 0 |
| 0.7937500000000001 | 0 |
| 0.7944444444444444 | 0 |
| 0.7951388888888888 | 0 |
| 0.7958333333333334 | 0 |
| 0.7965277777777778 | 0 |
| 0.7972222222222222 | 0 |
| 0.7979166666666666 | 0 |
| 0.7986111111111112 | 0 |
| 0.7993055555555556 | 0 |
| 0.7999999999999999 | 0 |
| 0.8006944444444444 | 0 |
| 0.8013888888888889 | 0 |
| 0.8020833333333334 | 0 |
| 0.8027777777777777 | 0 |
| 0.8034722222222223 | 0 |
| 0.8041666666666667 | 0 |
| 0.8048611111111111 | 0 |
| 0.8055555555555555 | 0 |
| 0.80625 | 0 |
| 0.8069444444444445 | 0 |
| 0.8076388888888889 | 0 |
| 0.8083333333333332 | 0 |
| 0.8090277777777778 | 0 |
| 0.8097222222222222 | 0 |
| 0.8104166666666667 | 0 |
| 0.811111111111111 | 0 |
| 0.8118055555555556 | 0 |
| 0.8125 | 0 |
| 0.8131944444444444 | 0 |
| 0.813888888888889 | 0 |
| 0.8145833333333333 | 0 |
| 0.8152777777777778 | 0 |
| 0.8159722222222222 | 0 |
| 0.8166666666666668 | 0 |
| 0.8173611111111111 | 0 |
| 0.8180555555555555 | 0 |
| 0.81875 | 0 |
| 0.8194444444444445 | 0 |
| 0.8201388888888889 | 0 |
| 0.8208333333333333 | 0 |
| 0.8215277777777777 | 0 |
| 0.8222222222222223 | 0 |
| 0.8229166666666666 | 0 |
| 0.8236111111111111 | 0 |
| 0.8243055555555556 | 0 |
| 0.8250000000000001 | 0 |
| 0.8256944444444444 | 0 |
| 0.8263888888888888 | 0 |
| 0.8270833333333334 | 0 |
| 0.8277777777777778 | 0 |
| 0.8284722222222222 | 0 |
| 0.8291666666666666 | 0 |
| 0.8298611111111112 | 0 |
| 0.8305555555555556 | 0 |
| 0.8312499999999999 | 0 |
| 0.8319444444444444 | 0 |
| 0.8326388888888889 | 0 |
| 0.8333333333333334 | 0 |
| 0.8340277777777777 | 0 |
| 0.8347222222222223 | 0 |
| 0.8354166666666667 | 0 |
| 0.8361111111111111 | 0 |
| 0.8368055555555555 | 0 |
| 0.8375 | 0 |
| 0.8381944444444445 | 0 |
| 0.8388888888888889 | 0 |
| 0.8395833333333332 | 0 |
| 0.8402777777777778 | 0 |
| 0.8409722222222222 | 0 |
| 0.8416666666666667 | 0 |
| 0.842361111111111 | 0 |
| 0.8430555555555556 | 0 |
| 0.84375 | 0 |
| 0.8444444444444444 | 0 |
| 0.845138888888889 | 0 |
| 0.8458333333333333 | 0 |
| 0.8465277777777778 | 0 |
| 0.8472222222222222 | 0 |
| 0.8479166666666668 | 0 |
| 0.8486111111111111 | 0 |
| 0.8493055555555555 | 0 |
| 0.85 | 0 |
| 0.8506944444444445 | 0 |
| 0.8513888888888889 | 0 |
| 0.8520833333333333 | 0 |
| 0.8527777777777777 | 0 |
| 0.8534722222222223 | 0 |
| 0.8541666666666666 | 0 |
| 0.8548611111111111 | 0 |
| 0.8555555555555556 | 0 |
| 0.8562500000000001 | 0 |
| 0.8569444444444444 | 0 |
| 0.8576388888888888 | 0 |
| 0.8583333333333334 | 0 |
| 0.8590277777777778 | 0 |
| 0.8597222222222222 | 0 |
| 0.8604166666666666 | 0 |
| 0.8611111111111112 | 0 |
| 0.8618055555555556 | 0 |
| 0.8624999999999999 | 0 |
| 0.8631944444444444 | 0 |
| 0.8638888888888889 | 0 |
| 0.8645833333333334 | 0 |
| 0.8652777777777777 | 0 |
| 0.8659722222222223 | 0 |
| 0.8666666666666667 | 0 |
| 0.8673611111111111 | 0 |
| 0.8680555555555555 | 0 |
| 0.86875 | 0 |
| 0.8694444444444445 | 0 |
| 0.8701388888888889 | 0 |
| 0.8708333333333332 | 0 |
| 0.8715277777777778 | 0 |
| 0.8722222222222222 | 0 |
| 0.8729166666666667 | 0 |
| 0.873611111111111 | 0 |
| 0.8743055555555556 | 0 |
| 0.875 | 0 |
| 0.8756944444444444 | 0 |
| 0.876388888888889 | 0 |
| 0.8770833333333333 | 0 |
| 0.8777777777777778 | 0 |
| 0.8784722222222222 | 0 |
| 0.8791666666666668 | 0 |
| 0.8798611111111111 | 0 |
| 0.8805555555555555 | 0 |
| 0.88125 | 0 |
| 0.8819444444444445 | 0 |
| 0.8826388888888889 | 0 |
| 0.8833333333333333 | 0 |
| 0.8840277777777777 | 0 |
| 0.8847222222222223 | 0 |
| 0.8854166666666666 | 0 |
| 0.8861111111111111 | 0 |
| 0.8868055555555556 | 0 |
| 0.8875000000000001 | 0 |
| 0.8881944444444444 | 0 |
| 0.8888888888888888 | 0 |
| 0.8895833333333334 | 0 |
| 0.8902777777777778 | 0 |
| 0.8909722222222222 | 0 |
| 0.8916666666666666 | 0 |
| 0.8923611111111112 | 0 |
| 0.8930555555555556 | 0 |
| 0.8937499999999999 | 0 |
| 0.8944444444444444 | 0 |
| 0.8951388888888889 | 0 |
| 0.8958333333333334 | 0 |
| 0.8965277777777777 | 0 |
| 0.8972222222222223 | 0 |
| 0.8979166666666667 | 0 |
| 0.8986111111111111 | 0 |
| 0.8993055555555555 | 0 |
| 0.9 | 0 |
| 0.9006944444444445 | 0 |
| 0.9013888888888889 | 0 |
| 0.9020833333333332 | 0 |
| 0.9027777777777778 | 0 |
| 0.9034722222222222 | 0 |
| 0.9041666666666667 | 0 |
| 0.904861111111111 | 0 |
| 0.9055555555555556 | 0 |
| 0.90625 | 0 |
| 0.9069444444444444 | 0 |
| 0.907638888888889 | 0 |
| 0.9083333333333333 | 0 |
| 0.9090277777777778 | 0 |
| 0.9097222222222222 | 0 |
| 0.9104166666666668 | 0 |
| 0.9111111111111111 | 0 |
| 0.9118055555555555 | 0 |
| 0.9125 | 0 |
| 0.9131944444444445 | 0 |
| 0.9138888888888889 | 0 |
| 0.9145833333333333 | 0 |
| 0.9152777777777777 | 0 |
| 0.9159722222222223 | 0 |
| 0.9166666666666666 | 0 |
| 0.9173611111111111 | 0 |
| 0.9180555555555556 | 0 |
| 0.9187500000000001 | 0 |
| 0.9194444444444444 | 0 |
| 0.9201388888888888 | 0 |
| 0.9208333333333334 | 0 |
| 0.9215277777777778 | 0 |
| 0.9222222222222222 | 0 |
| 0.9229166666666666 | 0 |
| 0.9236111111111112 | 0 |
| 0.9243055555555556 | 0 |
| 0.9249999999999999 | 0 |
| 0.9256944444444444 | 0 |
| 0.9263888888888889 | 0 |
| 0.9270833333333334 | 0 |
| 0.9277777777777777 | 0 |
| 0.9284722222222223 | 0 |
| 0.9291666666666667 | 0 |
| 0.9298611111111111 | 0 |
| 0.9305555555555555 | 0 |
| 0.93125 | 0 |
| 0.9319444444444445 | 0 |
| 0.9326388888888889 | 0 |
| 0.9333333333333332 | 0 |
| 0.9340277777777778 | 0 |
| 0.9347222222222222 | 0 |
| 0.9354166666666667 | 0 |
| 0.936111111111111 | 0 |
| 0.9368055555555556 | 0 |
| 0.9375 | 0 |
| 0.9381944444444444 | 0 |
| 0.938888888888889 | 0 |
| 0.9395833333333333 | 0 |
| 0.9402777777777778 | 0 |
| 0.9409722222222222 | 0 |
| 0.9416666666666668 | 0 |
| 0.9423611111111111 | 0 |
| 0.9430555555555555 | 0 |
| 0.94375 | 0 |
| 0.9444444444444445 | 0 |
| 0.9451388888888889 | 0 |
| 0.9458333333333333 | 0 |
| 0.9465277777777777 | 0 |
| 0.9472222222222223 | 0 |
| 0.9479166666666666 | 0 |
| 0.9486111111111111 | 0 |
| 0.9493055555555556 | 0 |
| 0.9500000000000001 | 0 |
| 0.9506944444444444 | 0 |
| 0.9513888888888888 | 0 |
| 0.9520833333333334 | 0 |
| 0.9527777777777778 | 0 |
| 0.9534722222222222 | 0 |
| 0.9541666666666666 | 0 |
| 0.9548611111111112 | 0 |
| 0.9555555555555556 | 0 |
| 0.9562499999999999 | 0 |
| 0.9569444444444444 | 0 |
| 0.9576388888888889 | 0 |
| 0.9583333333333334 | 0 |
| 0.9590277777777777 | 0 |
| 0.9597222222222223 | 0 |
| 0.9604166666666667 | 0 |
| 0.9611111111111111 | 0 |
| 0.9618055555555555 | 0 |
| 0.9625 | 0 |
| 0.9631944444444445 | 0 |
| 0.9638888888888889 | 0 |
| 0.9645833333333332 | 0 |
| 0.9652777777777778 | 0 |
| 0.9659722222222222 | 0 |
| 0.9666666666666667 | 0 |
| 0.967361111111111 | 0 |
| 0.9680555555555556 | 0 |
| 0.96875 | 0 |
| 0.9694444444444444 | 0 |
| 0.970138888888889 | 0 |
| 0.9708333333333333 | 0 |
| 0.9715277777777778 | 0 |
| 0.9722222222222222 | 0 |
| 0.9729166666666668 | 0 |
| 0.9736111111111111 | 0 |
| 0.9743055555555555 | 0 |
| 0.975 | 0 |
| 0.9756944444444445 | 0 |
| 0.9763888888888889 | 0 |
| 0.9770833333333333 | 0 |
| 0.9777777777777777 | 0 |
| 0.9784722222222223 | 0 |
| 0.9791666666666666 | 0 |
| 0.9798611111111111 | 0 |
| 0.9805555555555556 | 0 |
| 0.9812500000000001 | 0 |
| 0.9819444444444444 | 0 |
| 0.9826388888888888 | 0 |
| 0.9833333333333334 | 0 |
| 0.9840277777777778 | 0 |
| 0.9847222222222222 | 0 |
| 0.9854166666666666 | 0 |
| 0.9861111111111112 | 0 |
| 0.9868055555555556 | 0 |
| 0.9874999999999999 | 0 |
| 0.9881944444444444 | 0 |
| 0.9888888888888889 | 0 |
| 0.9895833333333334 | 0 |
| 0.9902777777777777 | 0 |
| 0.9909722222222223 | 0 |
| 0.9916666666666667 | 0 |
| 0.9923611111111111 | 0 |
| 0.9930555555555555 | 0 |
| 0.99375 | 0 |
| 0.9944444444444445 | 0 |
| 0.9951388888888889 | 0 |
| 0.9958333333333332 | 0 |
| 0.9965277777777778 | 0 |
| 0.9972222222222222 | 0 |
| 0.9979166666666667 | 0 |
| 0.998611111111111 | 0 |
| 0.9993055555555556 | 0 |